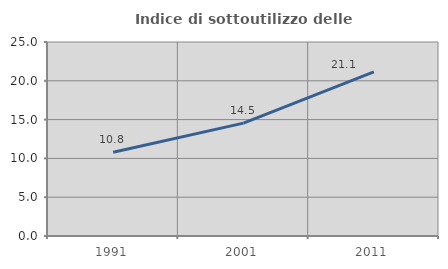
| Category | Indice di sottoutilizzo delle abitazioni  |
|---|---|
| 1991.0 | 10.788 |
| 2001.0 | 14.547 |
| 2011.0 | 21.149 |